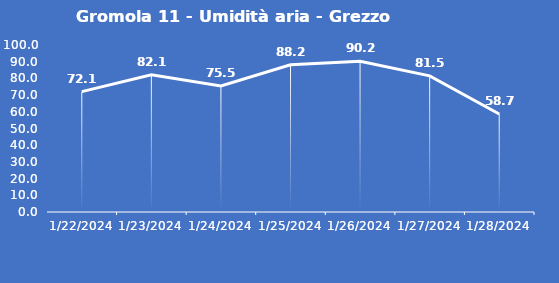
| Category | Gromola 11 - Umidità aria - Grezzo (%) |
|---|---|
| 1/22/24 | 72.1 |
| 1/23/24 | 82.1 |
| 1/24/24 | 75.5 |
| 1/25/24 | 88.2 |
| 1/26/24 | 90.2 |
| 1/27/24 | 81.5 |
| 1/28/24 | 58.7 |